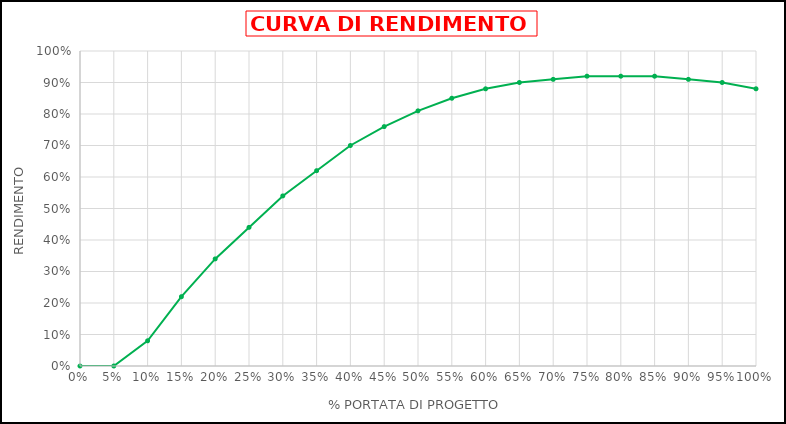
| Category | η |
|---|---|
| 0.0 | 0 |
| 0.05 | 0 |
| 0.1 | 0.08 |
| 0.15 | 0.22 |
| 0.2 | 0.34 |
| 0.25 | 0.44 |
| 0.3 | 0.54 |
| 0.35 | 0.62 |
| 0.4 | 0.7 |
| 0.45 | 0.76 |
| 0.5 | 0.81 |
| 0.55 | 0.85 |
| 0.6 | 0.88 |
| 0.65 | 0.9 |
| 0.7 | 0.91 |
| 0.75 | 0.92 |
| 0.8 | 0.92 |
| 0.85 | 0.92 |
| 0.9 | 0.91 |
| 0.95 | 0.9 |
| 1.0 | 0.88 |